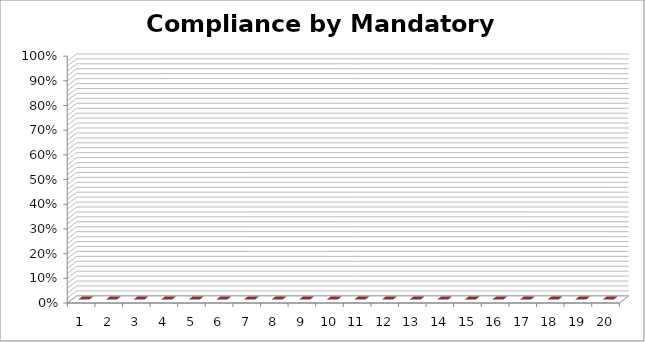
| Category | 1 2 3 4 5 6 7 8 9 10 11 12 13 14 15 16 17 18 19 20 |
|---|---|
| 0 | 0 |
| 1 | 0 |
| 2 | 0 |
| 3 | 0 |
| 4 | 0 |
| 5 | 0 |
| 6 | 0 |
| 7 | 0 |
| 8 | 0 |
| 9 | 0 |
| 10 | 0 |
| 11 | 0 |
| 12 | 0 |
| 13 | 0 |
| 14 | 0 |
| 15 | 0 |
| 16 | 0 |
| 17 | 0 |
| 18 | 0 |
| 19 | 0 |